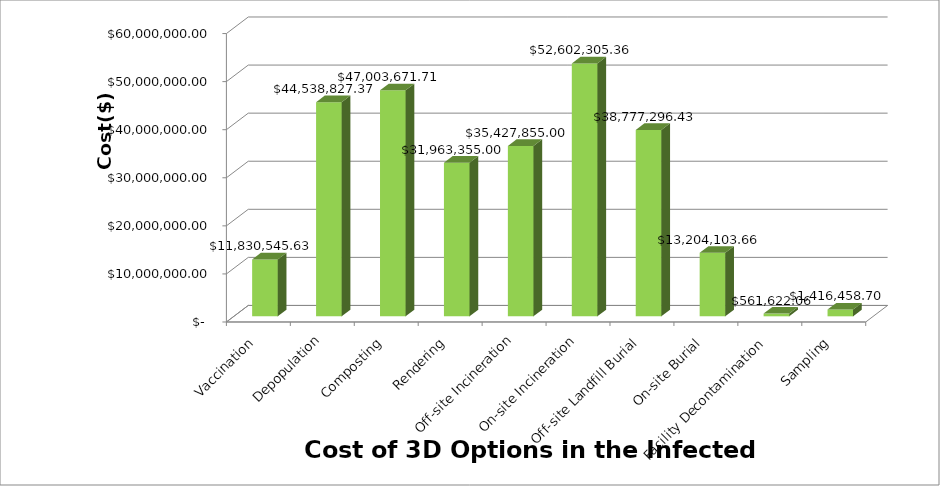
| Category | Series 0 |
|---|---|
| Vaccination | 11830545.625 |
| Depopulation | 44538827.371 |
| Composting | 47003671.714 |
| Rendering | 31963355 |
| Off-site Incineration | 35427855 |
| On-site Incineration | 52602305.357 |
| Off-site Landfill Burial | 38777296.429 |
| On-site Burial | 13204103.658 |
| Facility Decontamination | 561622.057 |
| Sampling | 1416458.704 |